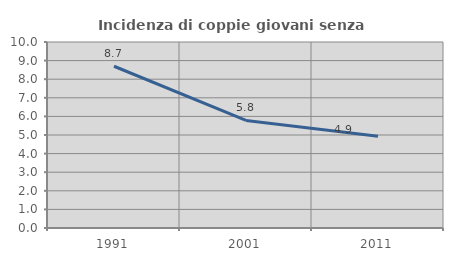
| Category | Incidenza di coppie giovani senza figli |
|---|---|
| 1991.0 | 8.696 |
| 2001.0 | 5.785 |
| 2011.0 | 4.938 |